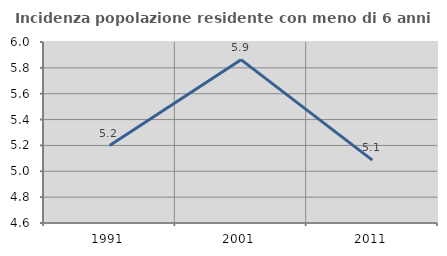
| Category | Incidenza popolazione residente con meno di 6 anni |
|---|---|
| 1991.0 | 5.199 |
| 2001.0 | 5.864 |
| 2011.0 | 5.087 |